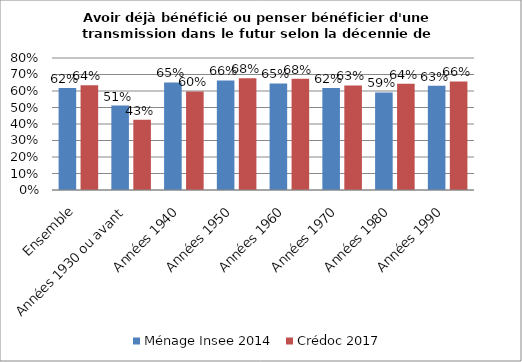
| Category | Ménage Insee 2014 | Crédoc 2017 |
|---|---|---|
| Ensemble | 0.618 | 0.635 |
| Années 1930 ou avant | 0.512 | 0.426 |
| Années 1940 | 0.652 | 0.597 |
| Années 1950 | 0.664 | 0.678 |
| Années 1960 | 0.646 | 0.675 |
| Années 1970 | 0.618 | 0.634 |
| Années 1980 | 0.591 | 0.644 |
| Années 1990 | 0.632 | 0.658 |